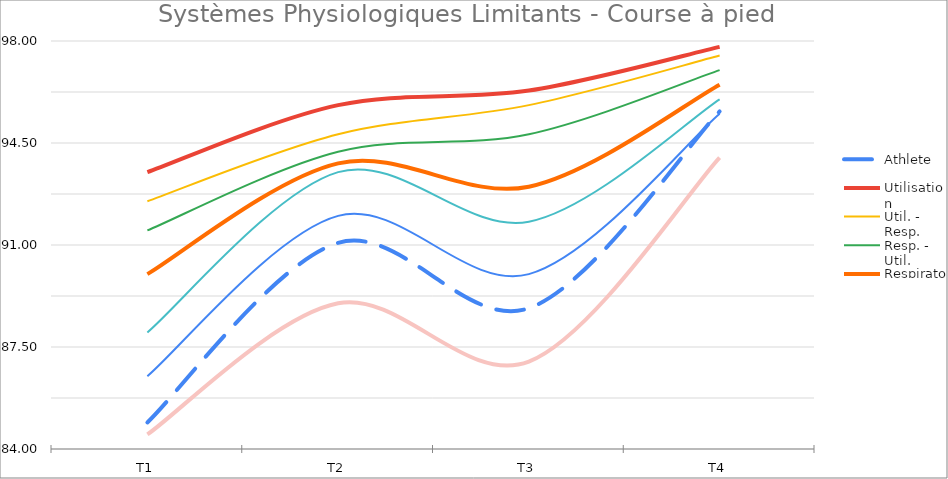
| Category | Athlete | Utilisation | Util. - Resp. | Resp. - Util. | Respiratoire | Resp. - Card. | Card. - Resp. | Cardiaque |
|---|---|---|---|---|---|---|---|---|
| T1 | 84.911 | 93.5 | 92.5 | 91.5 | 90 | 88 | 86.5 | 84.5 |
| T2 | 91.074 | 95.8 | 94.8 | 94.2 | 93.8 | 93.5 | 92 | 89 |
| T3 | 88.832 | 96.3 | 95.8 | 94.8 | 93 | 91.8 | 90 | 87 |
| T4 | 95.586 | 97.8 | 97.5 | 97 | 96.5 | 96 | 95.5 | 94 |